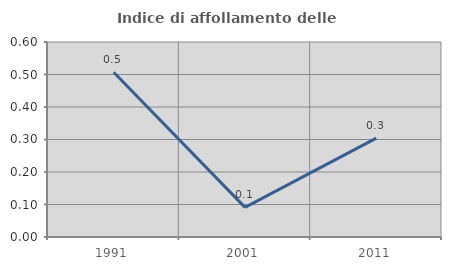
| Category | Indice di affollamento delle abitazioni  |
|---|---|
| 1991.0 | 0.507 |
| 2001.0 | 0.091 |
| 2011.0 | 0.304 |